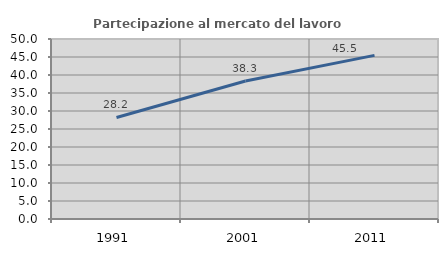
| Category | Partecipazione al mercato del lavoro  femminile |
|---|---|
| 1991.0 | 28.205 |
| 2001.0 | 38.339 |
| 2011.0 | 45.455 |